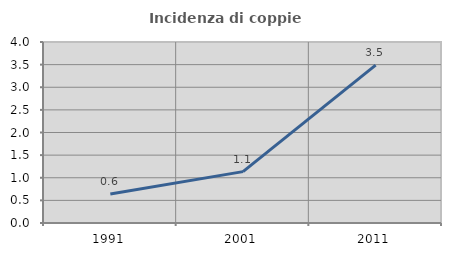
| Category | Incidenza di coppie miste |
|---|---|
| 1991.0 | 0.641 |
| 2001.0 | 1.135 |
| 2011.0 | 3.49 |